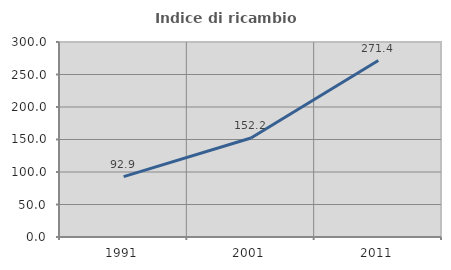
| Category | Indice di ricambio occupazionale  |
|---|---|
| 1991.0 | 92.949 |
| 2001.0 | 152.244 |
| 2011.0 | 271.399 |